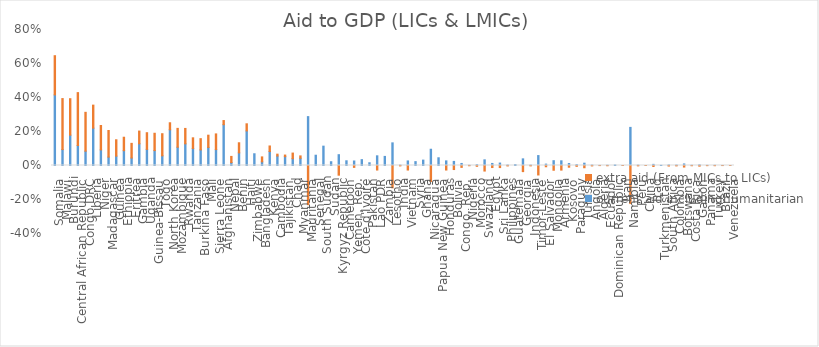
| Category | current aid includinghumanitarian | extra aid (From MICs to LICs) |
|---|---|---|
| Somalia | 0.415 | 0.231 |
| Malawi | 0.094 | 0.3 |
| Burundi | 0.179 | 0.214 |
| Central African Republic | 0.118 | 0.311 |
| Congo DRC | 0.084 | 0.229 |
| Liberia | 0.22 | 0.135 |
| Niger | 0.092 | 0.144 |
| Madagascar | 0.049 | 0.156 |
| Guinea | 0.055 | 0.096 |
| Ethiopia | 0.087 | 0.079 |
| Eritrea | 0.044 | 0.086 |
| Gambia | 0.128 | 0.075 |
| Uganda | 0.095 | 0.098 |
| Guinea-Bissau | 0.088 | 0.102 |
| Togo | 0.057 | 0.13 |
| North Korea | 0.21 | 0.041 |
| Mozambique | 0.108 | 0.111 |
| Rwanda | 0.127 | 0.091 |
| Tanzania | 0.1 | 0.062 |
| Burkina Faso | 0.092 | 0.066 |
| Mali | 0.106 | 0.072 |
| Sierra Leone | 0.094 | 0.092 |
| Afghanistan | 0.24 | 0.024 |
| Nepal | 0.017 | 0.036 |
| Benin | 0.074 | 0.059 |
| Haiti | 0.203 | 0.042 |
| Zimbabwe | 0.069 | 0 |
| Bangladesh | 0.022 | 0.029 |
| Kenya | 0.082 | 0.033 |
| Cambodia | 0.056 | 0.011 |
| Tajikistan | 0.052 | 0.009 |
| Chad | 0.04 | 0.033 |
| Myanmar | 0.043 | 0.014 |
| Mauritania | 0.288 | -0.23 |
| Senegal | 0.06 | 0 |
| South Sudan | 0.114 | 0 |
| Sudan | 0.022 | 0 |
| Kyrgyz Republic | 0.064 | -0.057 |
| Cameroon | 0.028 | 0 |
| Yemen, Rep. | 0.026 | -0.011 |
| Côte d'Ivoire | 0.034 | 0 |
| Pakistan | 0.016 | 0 |
| Lao PDR | 0.057 | -0.027 |
| Zambia | 0.053 | 0 |
| Lesotho | 0.133 | -0.131 |
| India | 0.002 | -0.002 |
| Vietnam | 0.027 | -0.027 |
| Syria | 0.023 | 0 |
| Ghana | 0.032 | 0 |
| Nicaragua | 0.096 | -0.094 |
| Papua New Guinea | 0.045 | 0 |
| Honduras | 0.027 | -0.027 |
| Bolivia | 0.024 | -0.024 |
| Congo, Rep. | 0.012 | -0.011 |
| Nigeria | 0.001 | -0.001 |
| Morocco | 0.005 | -0.005 |
| Swaziland | 0.033 | -0.033 |
| Egypt | 0.012 | -0.012 |
| Sri Lanka | 0.014 | -0.012 |
| Philippines | 0.003 | -0.003 |
| Guatemala | 0.005 | 0 |
| Georgia | 0.039 | -0.036 |
| Indonesia | 0.002 | -0.002 |
| Timor-Leste | 0.058 | -0.056 |
| El Salvador | 0.008 | -0.007 |
| Mongolia | 0.028 | -0.028 |
| Armenia | 0.028 | -0.027 |
| Kosovo | 0.012 | -0.01 |
| Paraguay | 0.005 | -0.005 |
| Tunisia | 0.014 | -0.013 |
| Angola | 0.003 | -0.002 |
| Algeria | 0.001 | 0 |
| Ecuador | 0.002 | -0.001 |
| Dominican Republic | 0.003 | 0 |
| Iran | 0 | 0 |
| Namibia | 0.224 | -0.224 |
| Peru | 0.002 | -0.002 |
| China | 0 | 0 |
| Iraq | 0.007 | -0.006 |
| Turkmenistan | 0.001 | 0 |
| South Africa | 0.003 | -0.003 |
| Colombia | 0.003 | -0.002 |
| Botswana | 0.009 | -0.009 |
| Costa Rica | 0.001 | -0.001 |
| Gabon | 0.004 | -0.004 |
| Panama | 0.001 | -0.001 |
| Turkey | 0.001 | -0.001 |
| Brazil | 0 | 0 |
| Venezuela | 0 | 0 |